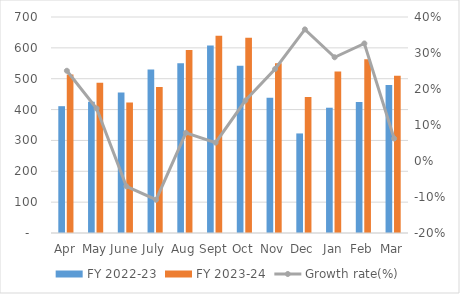
| Category | FY 2022-23 | FY 2023-24 |
|---|---|---|
| Apr | 411 | 514 |
| May | 425 | 487 |
| June | 455 | 423 |
| July | 530 | 473 |
| Aug | 550 | 593 |
| Sept | 608 | 639 |
| Oct | 542 | 633 |
| Nov | 438 | 550 |
| Dec | 322.644 | 440.6 |
| Jan | 406 | 523 |
| Feb | 424.432 | 563 |
| Mar | 480 | 510 |